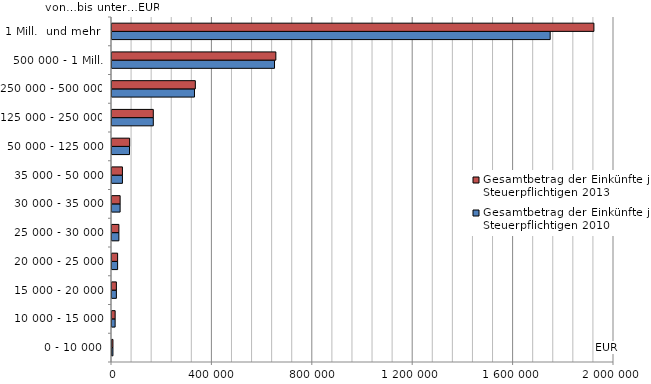
| Category | Gesamtbetrag der Einkünfte je Steuerpflichtigen 2010 | Gesamtbetrag der Einkünfte je Steuerpflichtigen 2013 |
|---|---|---|
| 0 - 10 000 | 3695 | 3767 |
| 10 000 - 15 000 | 12462 | 12543 |
| 15 000 - 20 000 | 17457 | 17491 |
| 20 000 - 25 000 | 22380 | 22397 |
| 25 000 - 30 000 | 27423 | 27413 |
| 30 000 - 35 000 | 32363 | 32379 |
| 35 000 - 50 000 | 41562 | 41564 |
| 50 000 - 125 000 | 69739 | 70251 |
| 125 000 - 250 000 | 164546 | 164557 |
| 250 000 - 500 000 | 328607 | 332002 |
| 500 000 - 1 Mill. | 647502 | 652803 |
| 1 Mill.  und mehr  | 1745729 | 1920000 |